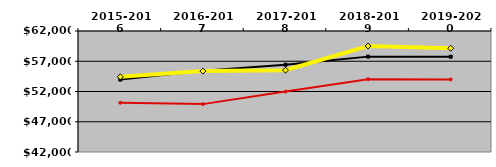
| Category | NATIONAL MEDIAN | WEST MEDIAN | TEXAS LUTHERAN |
|---|---|---|---|
| 2015-2016 | 53964 | 50139 | 54423 |
| 2016-2017 | 55410 | 49914 | 55368 |
| 2017-2018 | 56428 | 51986.5 | 55522 |
| 2018-2019 | 57764 | 54026.5 | 59522 |
| 2019-2020 | 57747 | 53995.5 | 59150 |